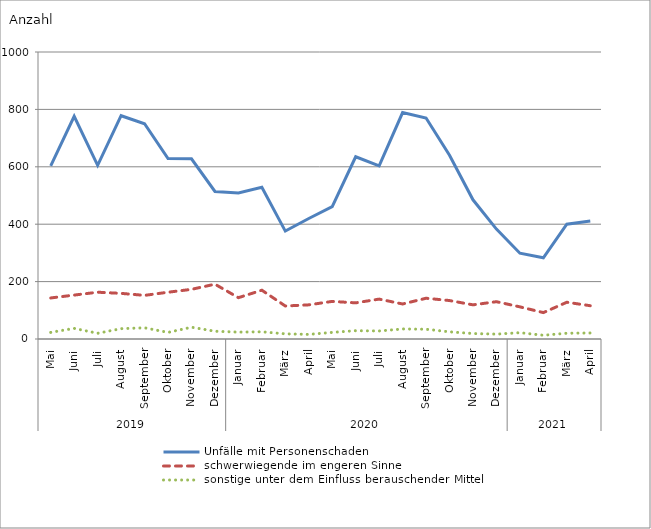
| Category | Unfälle mit Personenschaden | schwerwiegende im engeren Sinne | sonstige unter dem Einfluss berauschender Mittel |
|---|---|---|---|
| 0 | 603 | 143 | 23 |
| 1 | 776 | 153 | 37 |
| 2 | 605 | 163 | 20 |
| 3 | 778 | 159 | 36 |
| 4 | 750 | 152 | 39 |
| 5 | 629 | 163 | 23 |
| 6 | 628 | 173 | 41 |
| 7 | 514 | 191 | 27 |
| 8 | 509 | 144 | 24 |
| 9 | 529 | 170 | 25 |
| 10 | 376 | 115 | 18 |
| 11 | 420 | 119 | 16 |
| 12 | 461 | 131 | 23 |
| 13 | 635 | 126 | 29 |
| 14 | 603 | 139 | 28 |
| 15 | 789 | 122 | 35 |
| 16 | 770 | 142 | 34 |
| 17 | 640 | 134 | 25 |
| 18 | 485 | 119 | 19 |
| 19 | 383 | 130 | 17 |
| 20 | 299 | 112 | 22 |
| 21 | 283 | 92 | 13 |
| 22 | 400 | 128 | 20 |
| 23 | 411 | 116 | 21 |